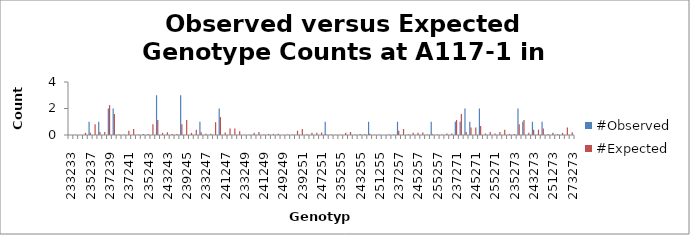
| Category | #Observed | #Expected |
|---|---|---|
| 233233.0 | 0 | 0.008 |
| 233235.0 | 0 | 0.016 |
| 235235.0 | 0 | 0.008 |
| 233237.0 | 0 | 0.161 |
| 235237.0 | 1 | 0.161 |
| 237237.0 | 0 | 0.806 |
| 233239.0 | 1 | 0.226 |
| 235239.0 | 0 | 0.226 |
| 237239.0 | 2 | 2.258 |
| 239239.0 | 2 | 1.581 |
| 233241.0 | 0 | 0.032 |
| 235241.0 | 0 | 0.032 |
| 237241.0 | 0 | 0.323 |
| 239241.0 | 0 | 0.452 |
| 241241.0 | 0 | 0.032 |
| 233243.0 | 0 | 0.081 |
| 235243.0 | 0 | 0.081 |
| 237243.0 | 0 | 0.806 |
| 239243.0 | 3 | 1.129 |
| 241243.0 | 0 | 0.161 |
| 243243.0 | 0 | 0.202 |
| 233245.0 | 0 | 0.081 |
| 235245.0 | 0 | 0.081 |
| 237245.0 | 3 | 0.806 |
| 239245.0 | 0 | 1.129 |
| 241245.0 | 0 | 0.161 |
| 243245.0 | 0 | 0.403 |
| 245245.0 | 1 | 0.202 |
| 233247.0 | 0 | 0.097 |
| 235247.0 | 0 | 0.097 |
| 237247.0 | 0 | 0.968 |
| 239247.0 | 2 | 1.355 |
| 241247.0 | 0 | 0.194 |
| 243247.0 | 0 | 0.484 |
| 245247.0 | 0 | 0.484 |
| 247247.0 | 0 | 0.29 |
| 233249.0 | 0 | 0.016 |
| 235249.0 | 0 | 0.016 |
| 237249.0 | 0 | 0.161 |
| 239249.0 | 0 | 0.226 |
| 241249.0 | 0 | 0.032 |
| 243249.0 | 0 | 0.081 |
| 245249.0 | 0 | 0.081 |
| 247249.0 | 0 | 0.097 |
| 249249.0 | 0 | 0.008 |
| 233251.0 | 0 | 0.032 |
| 235251.0 | 0 | 0.032 |
| 237251.0 | 0 | 0.323 |
| 239251.0 | 0 | 0.452 |
| 241251.0 | 0 | 0.065 |
| 243251.0 | 0 | 0.161 |
| 245251.0 | 0 | 0.161 |
| 247251.0 | 0 | 0.194 |
| 249251.0 | 1 | 0.032 |
| 251251.0 | 0 | 0.032 |
| 233255.0 | 0 | 0.016 |
| 235255.0 | 0 | 0.016 |
| 237255.0 | 0 | 0.161 |
| 239255.0 | 0 | 0.226 |
| 241255.0 | 0 | 0.032 |
| 243255.0 | 0 | 0.081 |
| 245255.0 | 0 | 0.081 |
| 247255.0 | 1 | 0.097 |
| 249255.0 | 0 | 0.016 |
| 251255.0 | 0 | 0.032 |
| 255255.0 | 0 | 0.008 |
| 233257.0 | 0 | 0.032 |
| 235257.0 | 0 | 0.032 |
| 237257.0 | 1 | 0.323 |
| 239257.0 | 0 | 0.452 |
| 241257.0 | 0 | 0.065 |
| 243257.0 | 0 | 0.161 |
| 245257.0 | 0 | 0.161 |
| 247257.0 | 0 | 0.194 |
| 249257.0 | 0 | 0.032 |
| 251257.0 | 1 | 0.065 |
| 255257.0 | 0 | 0.032 |
| 257257.0 | 0 | 0.032 |
| 233271.0 | 0 | 0.113 |
| 235271.0 | 0 | 0.113 |
| 237271.0 | 1 | 1.129 |
| 239271.0 | 1 | 1.581 |
| 241271.0 | 2 | 0.226 |
| 243271.0 | 1 | 0.565 |
| 245271.0 | 0 | 0.565 |
| 247271.0 | 2 | 0.677 |
| 249271.0 | 0 | 0.113 |
| 251271.0 | 0 | 0.226 |
| 255271.0 | 0 | 0.113 |
| 257271.0 | 0 | 0.226 |
| 271271.0 | 0 | 0.395 |
| 233273.0 | 0 | 0.081 |
| 235273.0 | 0 | 0.081 |
| 237273.0 | 2 | 0.806 |
| 239273.0 | 1 | 1.129 |
| 241273.0 | 0 | 0.161 |
| 243273.0 | 1 | 0.403 |
| 245273.0 | 0 | 0.403 |
| 247273.0 | 1 | 0.484 |
| 249273.0 | 0 | 0.081 |
| 251273.0 | 0 | 0.161 |
| 255273.0 | 0 | 0.081 |
| 257273.0 | 0 | 0.161 |
| 271273.0 | 0 | 0.565 |
| 273273.0 | 0 | 0.202 |